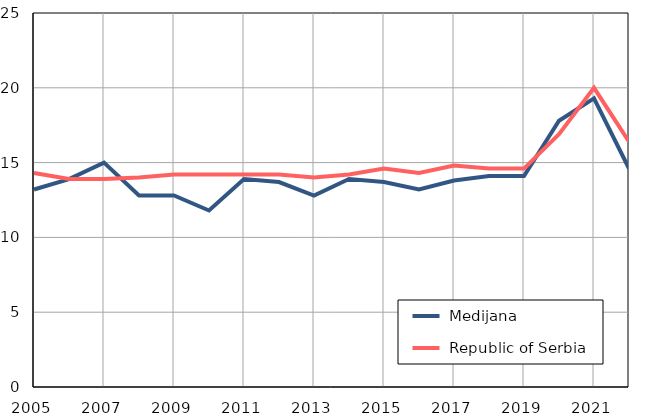
| Category |  Medijana |  Republic of Serbia |
|---|---|---|
| 2005.0 | 13.2 | 14.3 |
| 2006.0 | 13.9 | 13.9 |
| 2007.0 | 15 | 13.9 |
| 2008.0 | 12.8 | 14 |
| 2009.0 | 12.8 | 14.2 |
| 2010.0 | 11.8 | 14.2 |
| 2011.0 | 13.9 | 14.2 |
| 2012.0 | 13.7 | 14.2 |
| 2013.0 | 12.8 | 14 |
| 2014.0 | 13.9 | 14.2 |
| 2015.0 | 13.7 | 14.6 |
| 2016.0 | 13.2 | 14.3 |
| 2017.0 | 13.8 | 14.8 |
| 2018.0 | 14.1 | 14.6 |
| 2019.0 | 14.1 | 14.6 |
| 2020.0 | 17.8 | 16.9 |
| 2021.0 | 19.3 | 20 |
| 2022.0 | 14.6 | 16.4 |